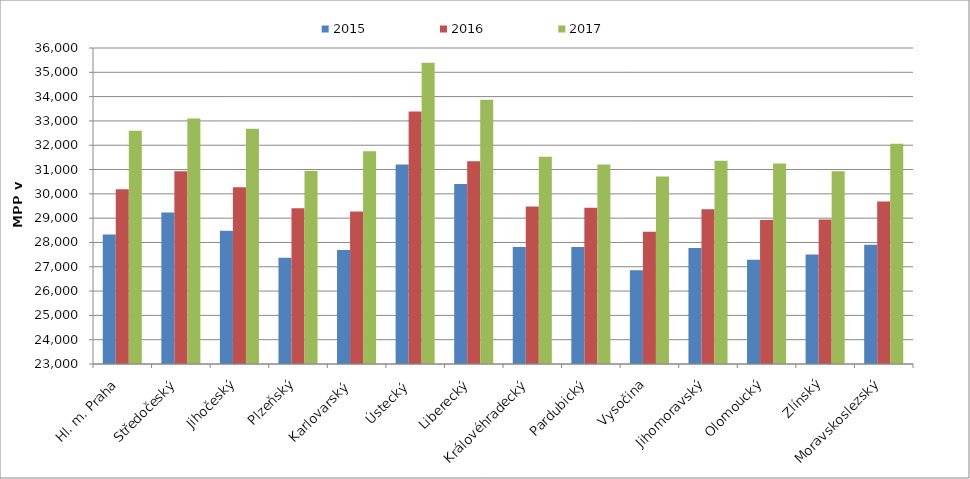
| Category | 2015 | 2016 | 2017 |
|---|---|---|---|
| Hl. m. Praha | 28331.163 | 30184.186 | 32599.814 |
| Středočeský | 29237.209 | 30928.604 | 33100.274 |
| Jihočeský | 28485.965 | 30275.072 | 32681.88 |
| Plzeňský | 27375 | 29403.694 | 30939.846 |
| Karlovarský  | 27688.048 | 29270.222 | 31756.496 |
| Ústecký   | 31208.669 | 33391.95 | 35395.666 |
| Liberecký | 30407.724 | 31340.208 | 33866.376 |
| Královéhradecký | 27809.29 | 29478.352 | 31530.237 |
| Pardubický | 27817.507 | 29431.663 | 31204.838 |
| Vysočina | 26861.301 | 28442.466 | 30718.151 |
| Jihomoravský | 27774.757 | 29366.637 | 31365.225 |
| Olomoucký | 27291.488 | 28928.977 | 31243.336 |
| Zlínský | 27500.896 | 28947.716 | 30931.15 |
| Moravskoslezský | 27908.894 | 29681.542 | 32062.249 |